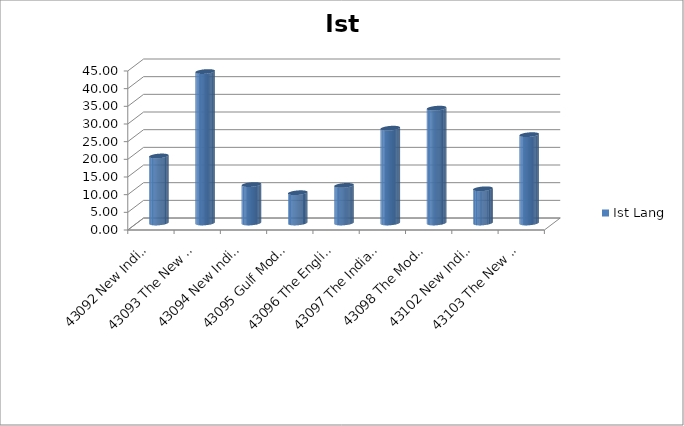
| Category | Ist Lang |
|---|---|
| 43092 New Indian Model School Dubai UAE | 18.97 |
| 43093 The New Indian Model School Sharjah | 42.86 |
| 43094 New Indian H S S Ras Al Khaimah, U.A.E | 10.87 |
| 43095 Gulf Model School Dubai UAE | 8.57 |
| 43096 The English School, Umm Al Quwain | 10.64 |
| 43097 The Indian School Fujairah UAE | 26.83 |
| 43098 The Model School Abu Dhabi UAE | 32.5 |
| 43102 New Indian Model School  Al Ain,  UAE | 9.68 |
| 43103 The New Indian School Umm Al Quwain  | 25 |